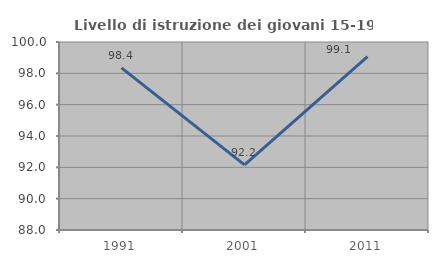
| Category | Livello di istruzione dei giovani 15-19 anni |
|---|---|
| 1991.0 | 98.352 |
| 2001.0 | 92.157 |
| 2011.0 | 99.07 |